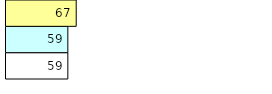
| Category | Total Standouts | Total Recd | Total Tipsters |
|---|---|---|---|
| 0 | 59 | 59 | 67 |